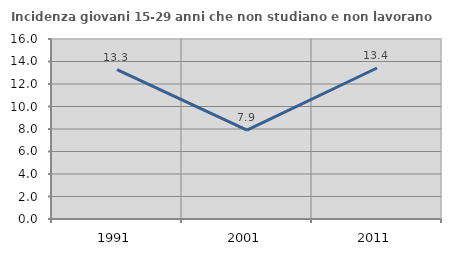
| Category | Incidenza giovani 15-29 anni che non studiano e non lavorano  |
|---|---|
| 1991.0 | 13.278 |
| 2001.0 | 7.899 |
| 2011.0 | 13.421 |